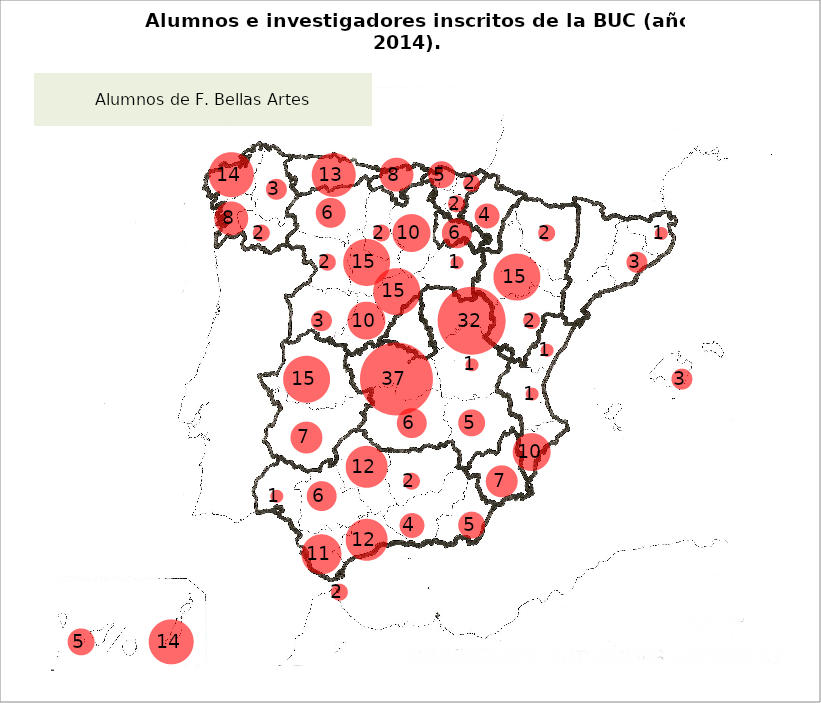
| Category | Series 1 |
|---|---|
| 14.0 | 5 |
| 9.0 | 4 |
| 10.5 | 7 |
| 12.0 | 5 |
| 7.5 | 6 |
| 12.0 | 6.5 |
| 10.5 | 4.5 |
| 9.0 | 6 |
| 16.5 | 15 |
| 16.0 | 12 |
| 15.5 | 13.5 |
| 11.5 | 17 |
| 10.5 | 12 |
| 12.0 | 15 |
| 9.3 | 15.7 |
| 11.0 | 15 |
| 9.0 | 12 |
| 11.5 | 13 |
| 13.5 | 14 |
| 10.5 | 14 |
| 9.2 | 14 |
| 14.0 | 8.5 |
| 12.0 | 8.5 |
| 14.0 | 10.5 |
| 14.0 | 12 |
| 11.5 | 10 |
| 19.5 | 14 |
| 20.3 | 15 |
| 18.0 | 15 |
| 18.0 | 13 |
| 9.6 | 2.7 |
| 16.0 | 7.5 |
| 16.5 | 11 |
| 16.0 | 9.5 |
| 8.5 | 8 |
| 8.5 | 10 |
| 6.0 | 17 |
| 7.5 | 16.5 |
| 7.0 | 15 |
| 6.0 | 15.5 |
| 21.0 | 10 |
| 4.0 | 1 |
| 1.0 | 1 |
| 13.5 | 15 |
| 12.9 | 1.8 |
| 14.5 | 15.6 |
| 13.5 | 16 |
| 13.0 | 17 |
| 14.0 | 16.7 |
| 9.4 | 17 |
| 15.0 | 6.5 |